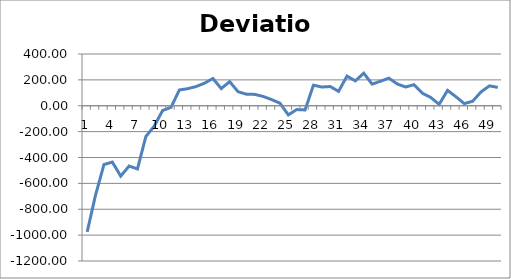
| Category | Deviation |
|---|---|
| 0 | -974.737 |
| 1 | -689.778 |
| 2 | -454.467 |
| 3 | -435.088 |
| 4 | -543.838 |
| 5 | -465.838 |
| 6 | -488.577 |
| 7 | -237.717 |
| 8 | -157.528 |
| 9 | -36.788 |
| 10 | -12.338 |
| 11 | 121.953 |
| 12 | 132.093 |
| 13 | 148.593 |
| 14 | 174.552 |
| 15 | 210.572 |
| 16 | 132.773 |
| 17 | 186.392 |
| 18 | 108.603 |
| 19 | 89.293 |
| 20 | 87.712 |
| 21 | 71.892 |
| 22 | 47.783 |
| 23 | 20.052 |
| 24 | -70.688 |
| 25 | -29.457 |
| 26 | -32.407 |
| 27 | 159.072 |
| 28 | 144.832 |
| 29 | 148.593 |
| 30 | 111.203 |
| 31 | 229.062 |
| 32 | 192.013 |
| 33 | 251.593 |
| 34 | 167.562 |
| 35 | 189.482 |
| 36 | 213.242 |
| 37 | 168.113 |
| 38 | 144.962 |
| 39 | 162.843 |
| 40 | 97.023 |
| 41 | 63.953 |
| 42 | 10.943 |
| 43 | 118.533 |
| 44 | 69.843 |
| 45 | 16.423 |
| 46 | 34.843 |
| 47 | 107.503 |
| 48 | 153.662 |
| 49 | 141.683 |